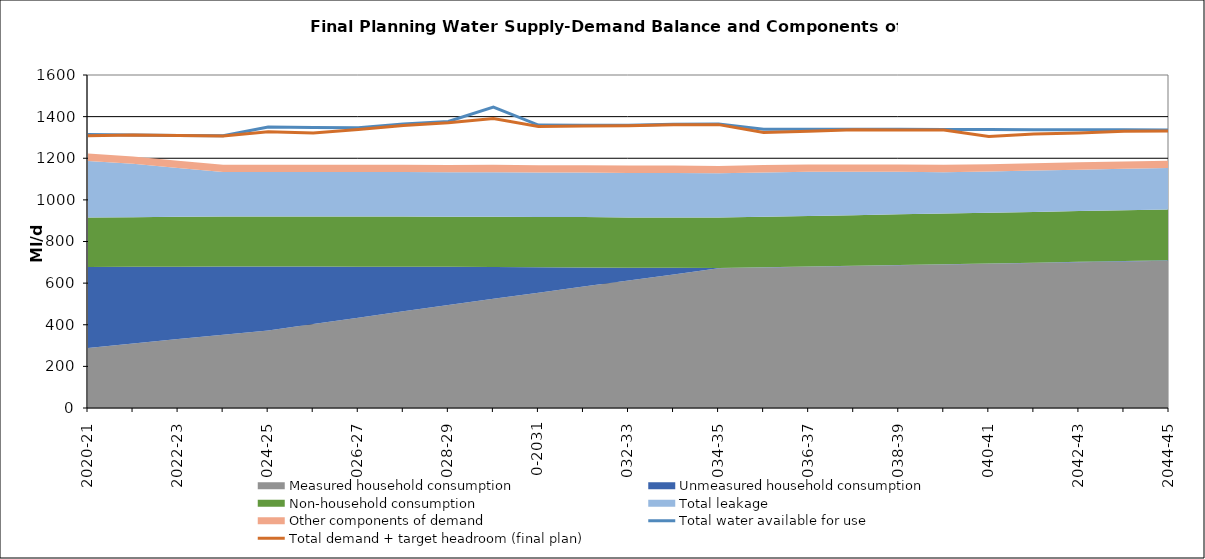
| Category | Total water available for use | Total demand + target headroom (final plan) |
|---|---|---|
| 0 | 1313.673 | 1307.521 |
| 1 | 1311.673 | 1311.59 |
| 2 | 1309.673 | 1309.456 |
| 3 | 1307.673 | 1307.336 |
| 4 | 1350.273 | 1327.366 |
| 5 | 1348.273 | 1321.8 |
| 6 | 1346.273 | 1337.764 |
| 7 | 1364.273 | 1357.819 |
| 8 | 1376.773 | 1370.159 |
| 9 | 1445.773 | 1391.247 |
| 10 | 1359.273 | 1352.936 |
| 11 | 1358.773 | 1354.38 |
| 12 | 1358.273 | 1355.868 |
| 13 | 1362.973 | 1360.753 |
| 14 | 1364.973 | 1361.537 |
| 15 | 1339.473 | 1324.127 |
| 16 | 1338.973 | 1329.677 |
| 17 | 1339.373 | 1336.473 |
| 18 | 1338.873 | 1336.131 |
| 19 | 1338.373 | 1335.782 |
| 20 | 1337.873 | 1304.71 |
| 21 | 1337.373 | 1315.965 |
| 22 | 1336.873 | 1321.849 |
| 23 | 1336.373 | 1329.982 |
| 24 | 1335.873 | 1330.85 |